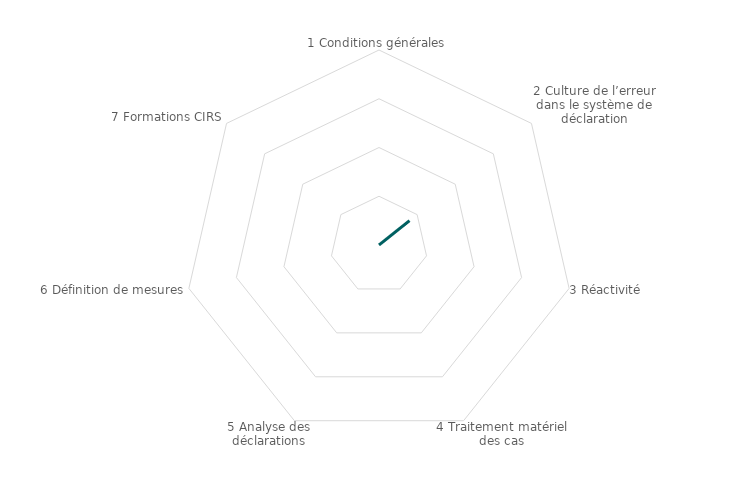
| Category | Series 0 |
|---|---|
| 1 Conditions générales | 0 |
| 2 Culture de l’erreur dans le système de déclaration | 0.2 |
| 3 Réactivité | 0 |
| 4 Traitement matériel des cas | 0 |
| 5 Analyse des déclarations | 0 |
| 6 Définition de mesures | 0 |
| 7 Formations CIRS | 0 |